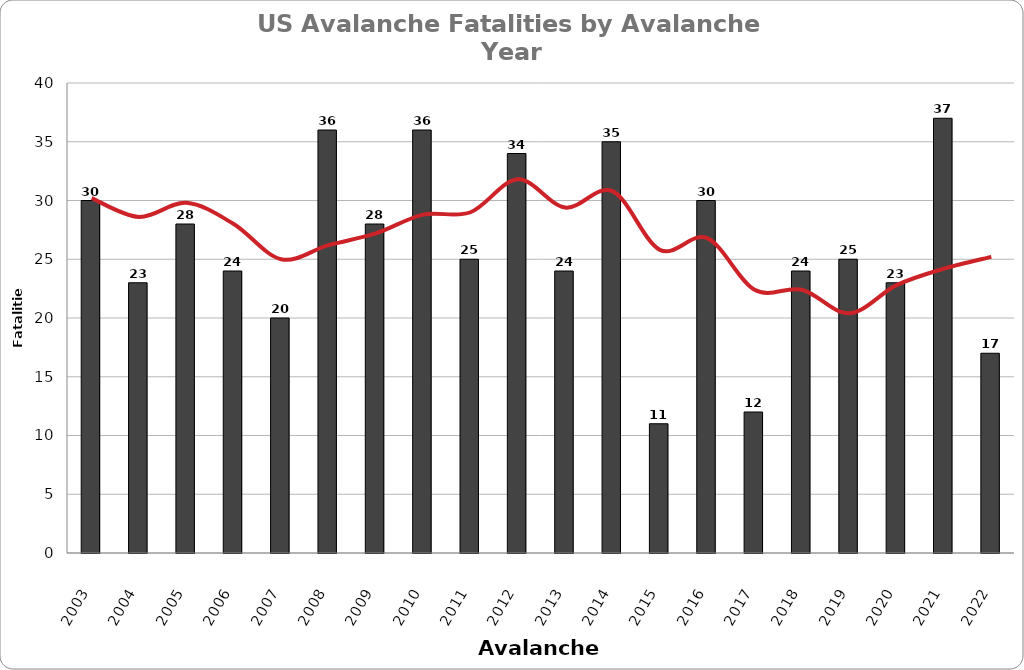
| Category | Series 0 |
|---|---|
| 2003.0 | 30 |
| 2004.0 | 23 |
| 2005.0 | 28 |
| 2006.0 | 24 |
| 2007.0 | 20 |
| 2008.0 | 36 |
| 2009.0 | 28 |
| 2010.0 | 36 |
| 2011.0 | 25 |
| 2012.0 | 34 |
| 2013.0 | 24 |
| 2014.0 | 35 |
| 2015.0 | 11 |
| 2016.0 | 30 |
| 2017.0 | 12 |
| 2018.0 | 24 |
| 2019.0 | 25 |
| 2020.0 | 23 |
| 2021.0 | 37 |
| 2022.0 | 17 |